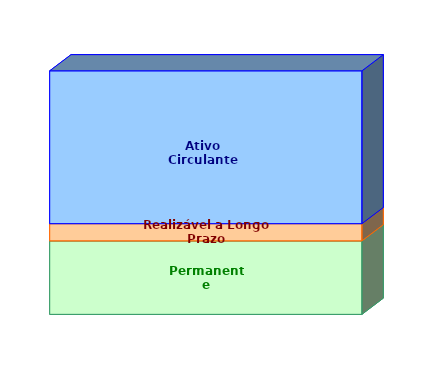
| Category | Permanente | Realizável a Longo Prazo | Ativo Circulante |
|---|---|---|---|
| 0 | 0.302 | 0.071 | 0.628 |